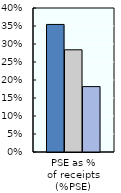
| Category | 1986-88 | 2000-02 | 2018-20 |
|---|---|---|---|
| PSE as %
of receipts (%PSE) | 0.354 | 0.284 | 0.182 |